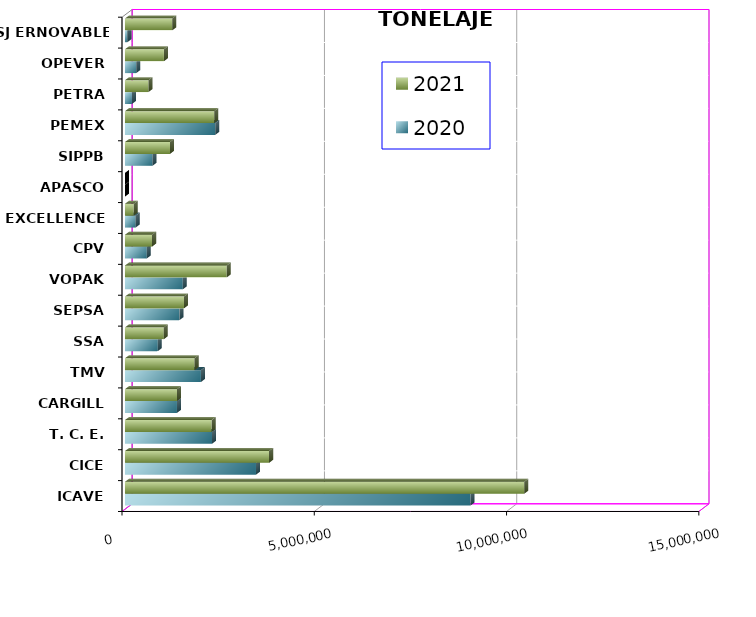
| Category | 2020 | 2021 |
|---|---|---|
| ICAVE | 8984021.827 | 10383962.586 |
| CICE | 3406733.77 | 3748373.777 |
| T. C. E. | 2263466.058 | 2254041.166 |
| CARGILL | 1352052.755 | 1353531.248 |
| TMV | 1974995.289 | 1809785.39 |
| SSA | 853405.143 | 1009390.448 |
| SEPSA | 1414804.51 | 1535289.04 |
| VOPAK | 1503544.482 | 2645000.452 |
| CPV | 567590.92 | 706135.108 |
| EXCELLENCE | 276016.469 | 226034.346 |
| APASCO | 0 | 0 |
| SIPPB | 717288.325 | 1171377.608 |
| PEMEX | 2347973.372 | 2322223.229 |
| PETRA | 181587.82 | 611175.81 |
| OPEVER | 293471.216 | 1013262.228 |
| ESJ ERNOVABLE III | 62352.985 | 1231035.815 |